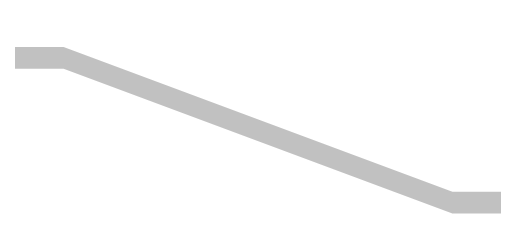
| Category | S1 | S2 | S3 |
|---|---|---|---|
| 0.0 | 220 | 200 | 1510 |
| 10.0 | 220 | 200 | 1510 |
| 90.0 | 1550 | 200 | 180 |
| 100.0 | 1550 | 200 | 180 |